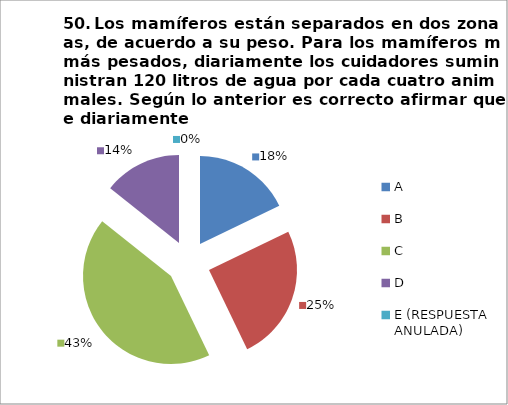
| Category | CANTIDAD DE RESPUESTAS PREGUNTA (50) | PORCENTAJE |
|---|---|---|
| A | 5 | 0.179 |
| B | 7 | 0.25 |
| C | 12 | 0.429 |
| D | 4 | 0.143 |
| E (RESPUESTA ANULADA) | 0 | 0 |